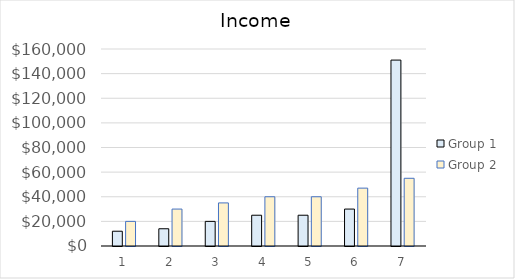
| Category | Group 1 | Group 2 |
|---|---|---|
| 0 | 12000 | 20000 |
| 1 | 14000 | 30000 |
| 2 | 20000 | 35000 |
| 3 | 25000 | 40000 |
| 4 | 25000 | 40000 |
| 5 | 30000 | 47000 |
| 6 | 151000 | 55000 |